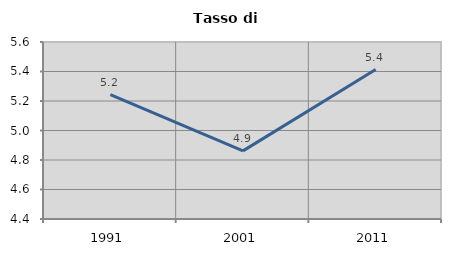
| Category | Tasso di disoccupazione   |
|---|---|
| 1991.0 | 5.244 |
| 2001.0 | 4.862 |
| 2011.0 | 5.413 |